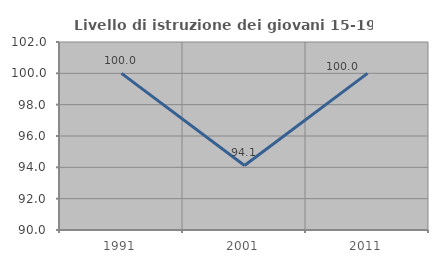
| Category | Livello di istruzione dei giovani 15-19 anni |
|---|---|
| 1991.0 | 100 |
| 2001.0 | 94.118 |
| 2011.0 | 100 |